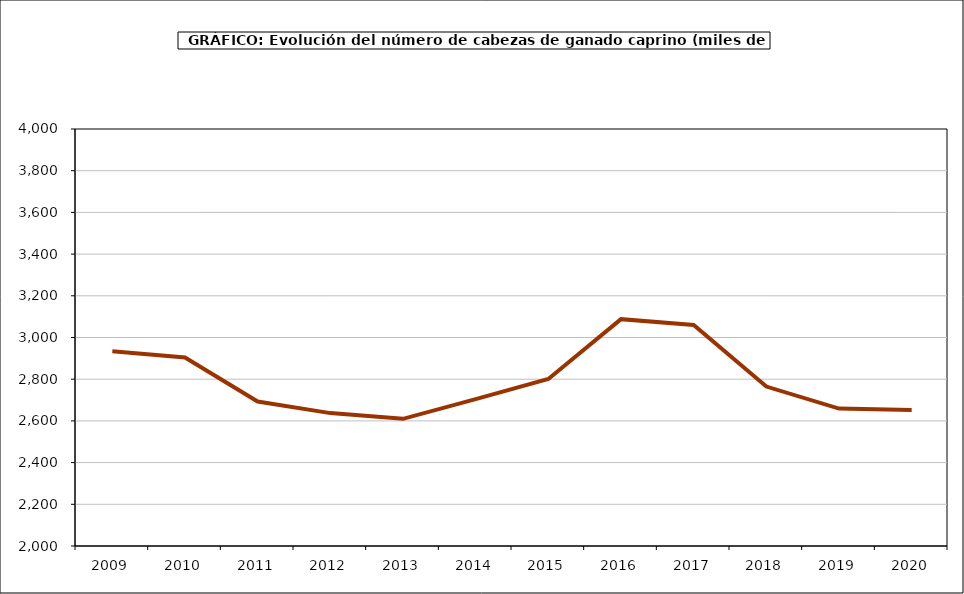
| Category | Total Ovino |
|---|---|
| 2009.0 | 2933.782 |
| 2010.0 | 2904 |
| 2011.0 | 2693 |
| 2012.0 | 2637.336 |
| 2013.0 | 2609.989 |
| 2014.0 | 2704.229 |
| 2015.0 | 2801.064 |
| 2016.0 | 3088.035 |
| 2017.0 | 3059.731 |
| 2018.0 | 2764.79 |
| 2019.0 | 2659 |
| 2020.0 | 2652 |